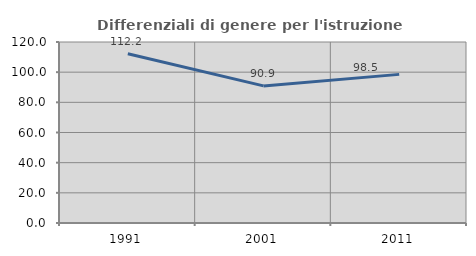
| Category | Differenziali di genere per l'istruzione superiore |
|---|---|
| 1991.0 | 112.226 |
| 2001.0 | 90.9 |
| 2011.0 | 98.539 |